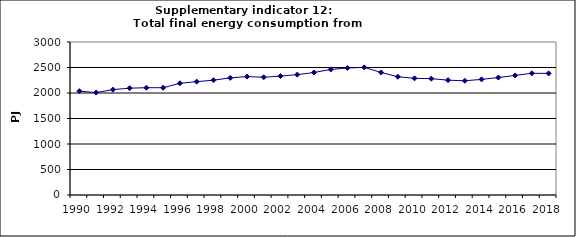
| Category | Total final energy consumption from transport, PJ |
|---|---|
| 1990 | 2036.25 |
| 1991 | 2008.534 |
| 1992 | 2066.395 |
| 1993 | 2094.405 |
| 1994 | 2103.993 |
| 1995 | 2103.365 |
| 1996 | 2190.592 |
| 1997 | 2222.459 |
| 1998 | 2251.326 |
| 1999 | 2296.589 |
| 2000 | 2322.046 |
| 2001 | 2308.488 |
| 2002 | 2331.413 |
| 2003 | 2359.923 |
| 2004 | 2402.141 |
| 2005 | 2461.552 |
| 2006 | 2491.207 |
| 2007 | 2502.489 |
| 2008 | 2402.943 |
| 2009 | 2319.216 |
| 2010 | 2287.498 |
| 2011 | 2281.518 |
| 2012 | 2251.513 |
| 2013 | 2239.507 |
| 2014 | 2266.977 |
| 2015 | 2303.269 |
| 2016 | 2344.63 |
| 2017 | 2386.562 |
| 2018 | 2384.559 |